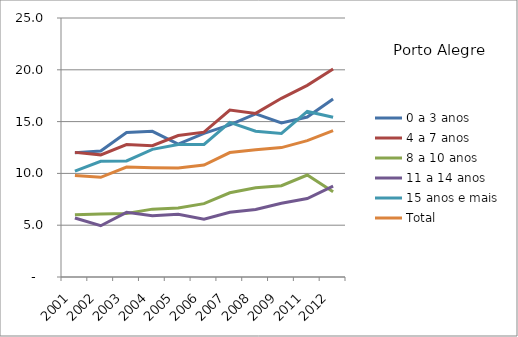
| Category | 0 a 3 anos | 4 a 7 anos | 8 a 10 anos | 11 a 14 anos | 15 anos e mais | Total |
|---|---|---|---|---|---|---|
| 2001.0 | 11.99 | 12.03 | 6 | 5.7 | 10.21 | 9.79 |
| 2002.0 | 12.16 | 11.79 | 6.09 | 4.95 | 11.17 | 9.62 |
| 2003.0 | 13.94 | 12.79 | 6.12 | 6.24 | 11.2 | 10.61 |
| 2004.0 | 14.06 | 12.67 | 6.55 | 5.92 | 12.32 | 10.55 |
| 2005.0 | 12.83 | 13.65 | 6.66 | 6.06 | 12.78 | 10.53 |
| 2006.0 | 13.87 | 13.98 | 7.08 | 5.57 | 12.8 | 10.8 |
| 2007.0 | 14.69 | 16.12 | 8.13 | 6.24 | 14.93 | 12.01 |
| 2008.0 | 15.74 | 15.79 | 8.61 | 6.51 | 14.07 | 12.28 |
| 2009.0 | 14.87 | 17.25 | 8.81 | 7.12 | 13.86 | 12.49 |
| 2011.0 | 15.44 | 18.5 | 9.84 | 7.57 | 15.98 | 13.16 |
| 2012.0 | 17.19 | 20.07 | 8.22 | 8.77 | 15.42 | 14.13 |